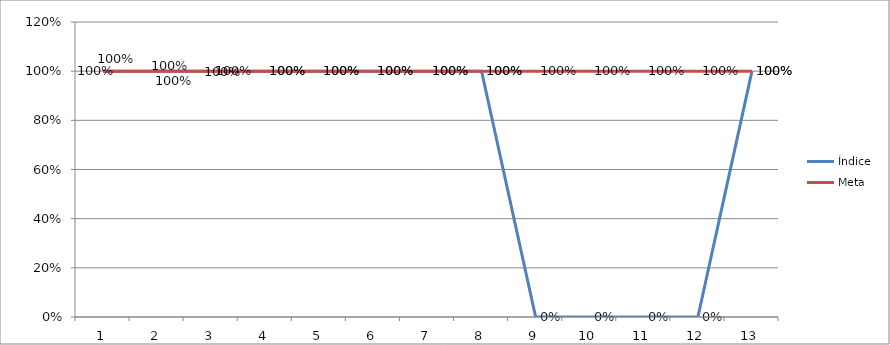
| Category | Índice | Meta |
|---|---|---|
| 0 | 1 | 1 |
| 1 | 1 | 1 |
| 2 | 1 | 1 |
| 3 | 1 | 1 |
| 4 | 1 | 1 |
| 5 | 1 | 1 |
| 6 | 1 | 1 |
| 7 | 1 | 1 |
| 8 | 0 | 1 |
| 9 | 0 | 1 |
| 10 | 0 | 1 |
| 11 | 0 | 1 |
| 12 | 1 | 1 |